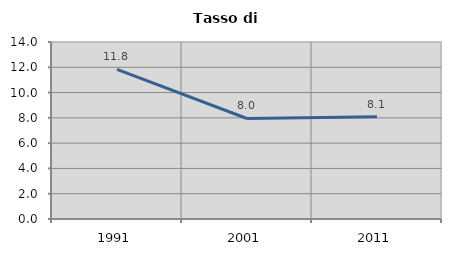
| Category | Tasso di disoccupazione   |
|---|---|
| 1991.0 | 11.829 |
| 2001.0 | 7.95 |
| 2011.0 | 8.08 |